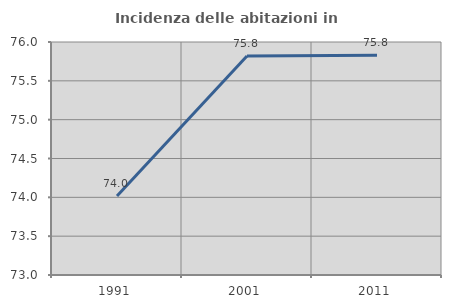
| Category | Incidenza delle abitazioni in proprietà  |
|---|---|
| 1991.0 | 74.018 |
| 2001.0 | 75.819 |
| 2011.0 | 75.83 |